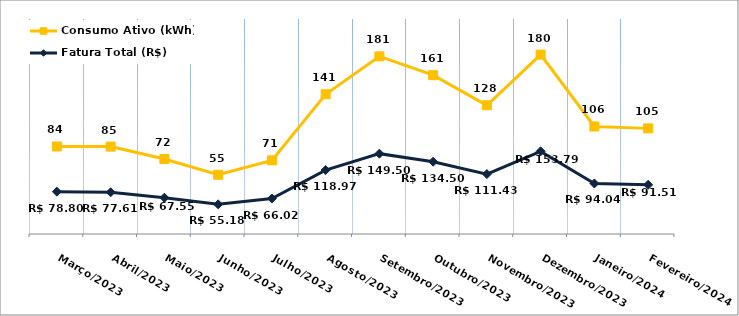
| Category | Fatura Total (R$) | Consumo Ativo (kWh) |
|---|---|---|
| Março/2023 | 78.8 | 84 |
| Abril/2023 | 77.61 | 85 |
| Maio/2023 | 67.55 | 72 |
| Junho/2023 | 55.18 | 55 |
| Julho/2023 | 66.02 | 71 |
| Agosto/2023 | 118.97 | 141 |
| Setembro/2023 | 149.5 | 181 |
| Outubro/2023 | 134.5 | 161 |
| Novembro/2023 | 111.43 | 128 |
| Dezembro/2023 | 153.79 | 180 |
| Janeiro/2024 | 94.04 | 106 |
| Fevereiro/2024 | 91.51 | 105 |